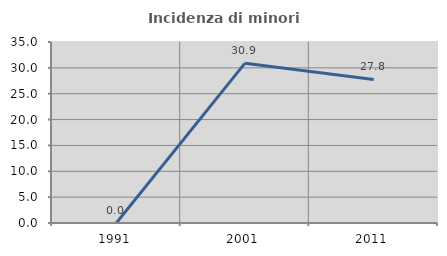
| Category | Incidenza di minori stranieri |
|---|---|
| 1991.0 | 0 |
| 2001.0 | 30.909 |
| 2011.0 | 27.76 |